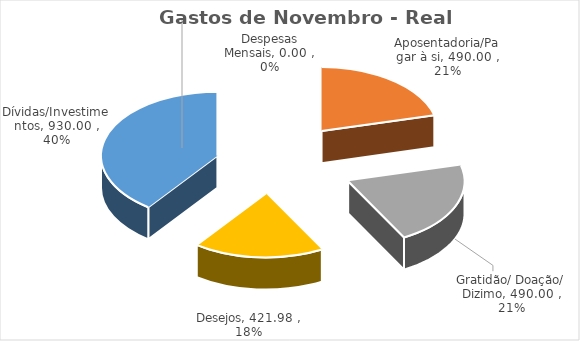
| Category | Gastos de Novembro - Real Acumulado |
|---|---|
| Despesas Mensais | 0 |
| Aposentadoria/Pagar à si | 490 |
| Gratidão/ Doação/ Dizimo | 490 |
| Desejos | 421.98 |
| Dívidas/Investimentos | 930 |